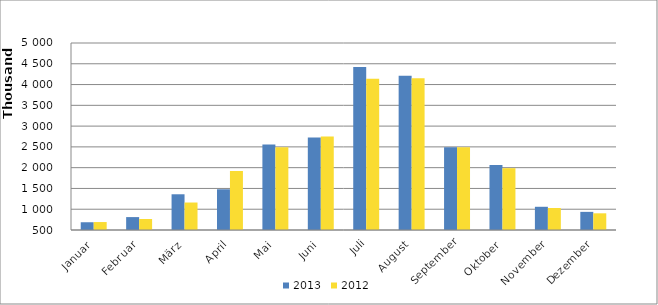
| Category | 2013 | 2012 |
|---|---|---|
| Januar | 686519 | 691347 |
| Februar | 810663 | 764463 |
| März | 1359752 | 1161301 |
| April | 1480218 | 1920116 |
| Mai | 2556394 | 2491862 |
| Juni | 2727144 | 2752697 |
| Juli | 4421298 | 4140897 |
| August | 4211282 | 4150126 |
| September | 2494002 | 2492421 |
| Oktober | 2063935 | 1987828 |
| November | 1058604 | 1029799 |
| Dezember | 936409 | 901555 |